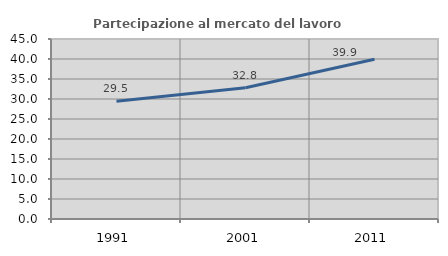
| Category | Partecipazione al mercato del lavoro  femminile |
|---|---|
| 1991.0 | 29.463 |
| 2001.0 | 32.823 |
| 2011.0 | 39.921 |